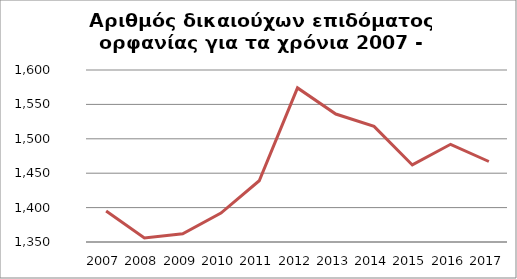
| Category |  1.395      |
|---|---|
| 2007.0 | 1395 |
| 2008.0 | 1356 |
| 2009.0 | 1362 |
| 2010.0 | 1392 |
| 2011.0 | 1439 |
| 2012.0 | 1574 |
| 2013.0 | 1536 |
| 2014.0 | 1518 |
| 2015.0 | 1462 |
| 2016.0 | 1492 |
| 2017.0 | 1467 |